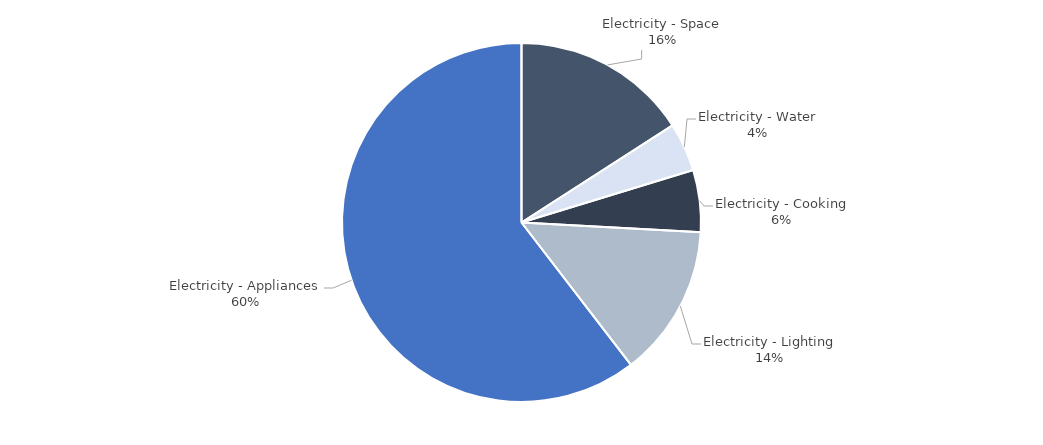
| Category | Series 0 |
|---|---|
| Electricity - Space | 1474.743 |
| Electricity - Water | 405.265 |
| Electricity - Cooking | 518.424 |
| Electricity - Lighting | 1270.626 |
| Electricity - Appliances | 5604.106 |